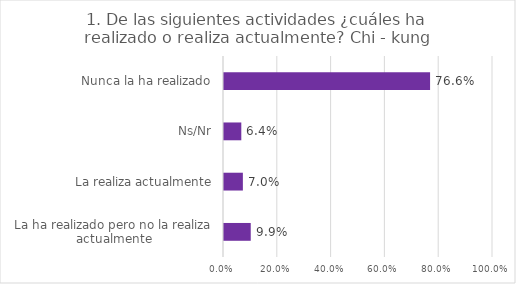
| Category | Series 0 |
|---|---|
| La ha realizado pero no la realiza actualmente | 0.099 |
| La realiza actualmente | 0.07 |
| Ns/Nr | 0.064 |
| Nunca la ha realizado | 0.766 |